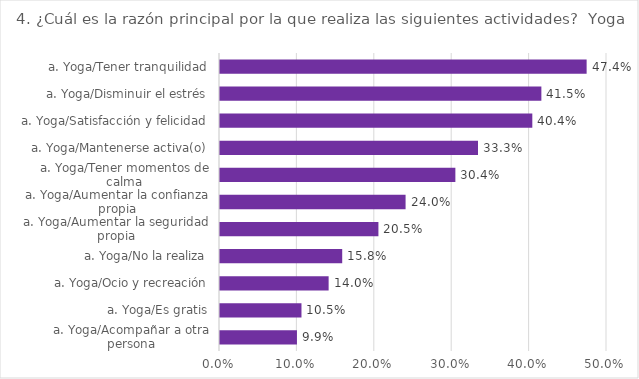
| Category | Series 0 |
|---|---|
| a. Yoga/Acompañar a otra persona | 0.099 |
| a. Yoga/Es gratis | 0.105 |
| a. Yoga/Ocio y recreación | 0.14 |
| a. Yoga/No la realiza | 0.158 |
| a. Yoga/Aumentar la seguridad propia | 0.205 |
| a. Yoga/Aumentar la confianza propia | 0.24 |
| a. Yoga/Tener momentos de calma | 0.304 |
| a. Yoga/Mantenerse activa(o) | 0.333 |
| a. Yoga/Satisfacción y felicidad | 0.404 |
| a. Yoga/Disminuir el estrés | 0.415 |
| a. Yoga/Tener tranquilidad | 0.474 |